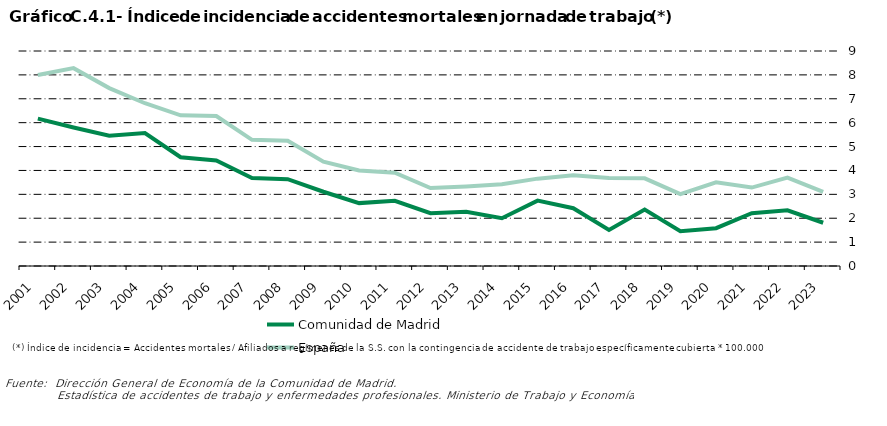
| Category | Comunidad de Madrid | España |
|---|---|---|
| 2001.0 | 6.171 | 7.997 |
| 2002.0 | 5.796 | 8.282 |
| 2003.0 | 5.454 | 7.447 |
| 2004.0 | 5.566 | 6.814 |
| 2005.0 | 4.553 | 6.31 |
| 2006.0 | 4.42 | 6.28 |
| 2007.0 | 3.68 | 5.28 |
| 2008.0 | 3.636 | 5.243 |
| 2009.0 | 3.109 | 4.364 |
| 2010.0 | 2.633 | 3.996 |
| 2011.0 | 2.727 | 3.906 |
| 2012.0 | 2.212 | 3.263 |
| 2013.0 | 2.274 | 3.327 |
| 2014.0 | 1.998 | 3.422 |
| 2015.0 | 2.738 | 3.657 |
| 2016.0 | 2.42 | 3.797 |
| 2017.0 | 1.508 | 3.686 |
| 2018.0 | 2.364 | 3.671 |
| 2019.0 | 1.459 | 3.01 |
| 2020.0 | 1.584 | 3.505 |
| 2021.0 | 2.212 | 3.284 |
| 2022.0 | 2.33 | 3.698 |
| 2023.0 | 1.811 | 3.1 |